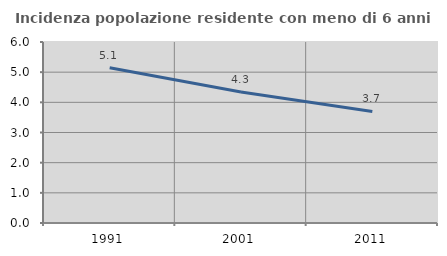
| Category | Incidenza popolazione residente con meno di 6 anni |
|---|---|
| 1991.0 | 5.147 |
| 2001.0 | 4.342 |
| 2011.0 | 3.698 |